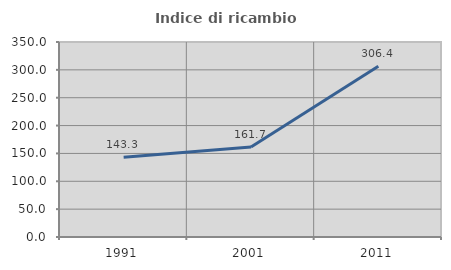
| Category | Indice di ricambio occupazionale  |
|---|---|
| 1991.0 | 143.295 |
| 2001.0 | 161.702 |
| 2011.0 | 306.41 |